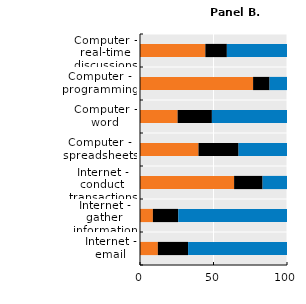
| Category | Never | Less than once a week | At least once a week |
|---|---|---|---|
| Internet - email | 12.139 | 20.588 | 67.272 |
| Internet - gather information | 8.771 | 17.276 | 73.953 |
| Internet - conduct transactions | 64.022 | 19.371 | 16.607 |
| Computer - spreadsheets | 39.806 | 27.257 | 32.937 |
| Computer - word | 25.588 | 23.318 | 51.094 |
| Computer - programming | 76.935 | 11.202 | 11.863 |
| Computer - real-time discussions | 44.462 | 14.627 | 40.912 |